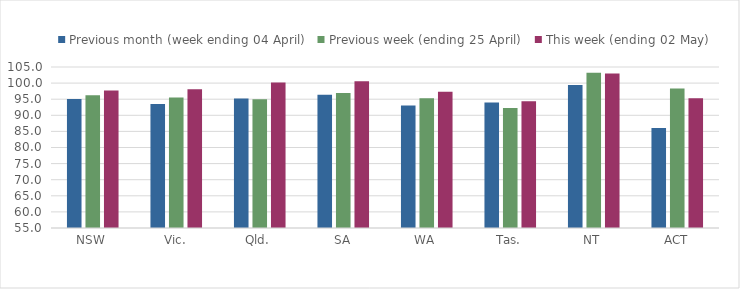
| Category | Previous month (week ending 04 April) | Previous week (ending 25 April) | This week (ending 02 May) |
|---|---|---|---|
| NSW | 95.039 | 96.199 | 97.731 |
| Vic. | 93.502 | 95.531 | 98.099 |
| Qld. | 95.208 | 94.993 | 100.21 |
| SA | 96.397 | 96.89 | 100.58 |
| WA | 93.056 | 95.267 | 97.295 |
| Tas. | 93.973 | 92.236 | 94.348 |
| NT | 99.434 | 103.239 | 102.949 |
| ACT | 86.075 | 98.322 | 95.309 |